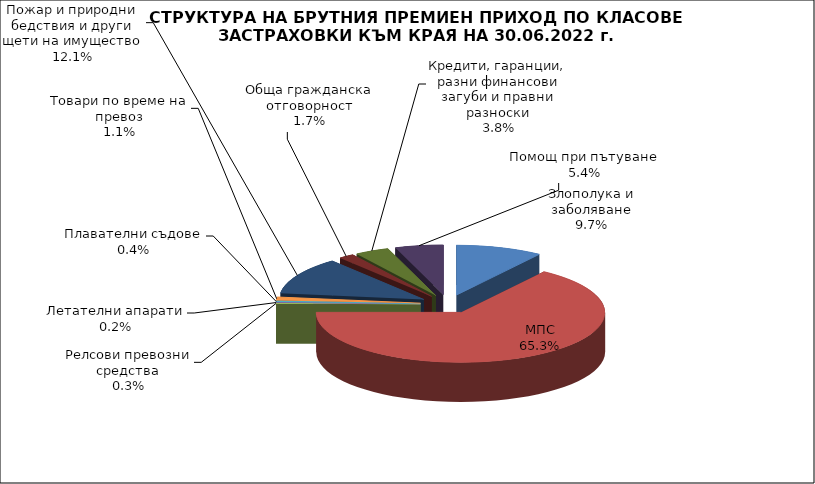
| Category | Злополука и заболяване |
|---|---|
| Злополука и заболяване | 0.097 |
| МПС | 0.653 |
| Релсови превозни средства | 0.003 |
| Летателни апарати | 0.002 |
| Плавателни съдове | 0.004 |
| Товари по време на превоз | 0.011 |
| Пожар и природни бедствия и други щети на имущество | 0.121 |
| Обща гражданска отговорност | 0.017 |
| Кредити, гаранции, разни финансови загуби и правни разноски | 0.038 |
| Помощ при пътуване | 0.054 |